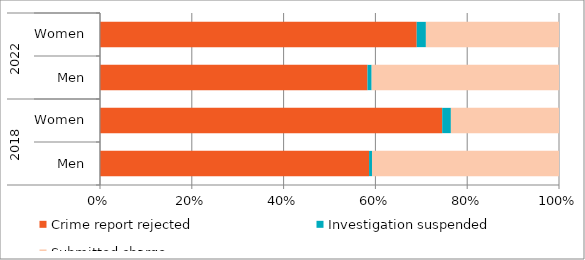
| Category | Crime report rejected | Investigation suspended | Submitted charge
 sheet-summary charge sheet  |
|---|---|---|---|
| 0 | 58.622 | 0.632 | 40.747 |
| 1 | 74.553 | 1.893 | 23.554 |
| 2 | 58.269 | 0.917 | 40.814 |
| 3 | 69 | 2 | 29 |